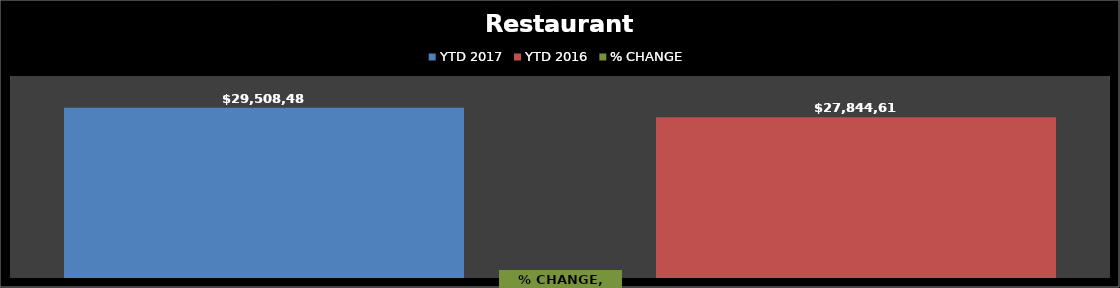
| Category | YTD 2017 | YTD 2016 |
|---|---|---|
| Restaurant Tax Distribution - 2017 | 29508487.24 | 27844618.241 |